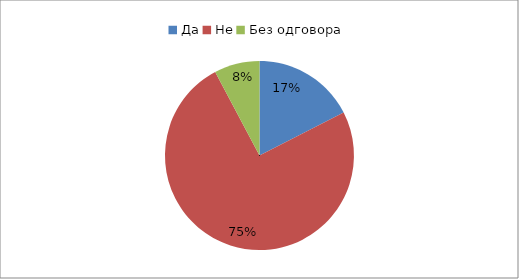
| Category | Series 0 |
|---|---|
| Да | 0.175 |
| Не | 0.748 |
| Без одговора | 0.078 |